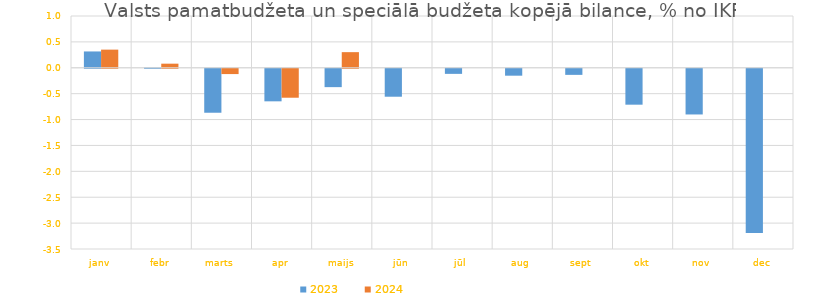
| Category | 2023 | 2024 |
|---|---|---|
| janv | 0.315 | 0.35 |
| febr | 0.007 | 0.079 |
| marts | -0.849 | -0.102 |
| apr | -0.629 | -0.559 |
| maijs | -0.355 | 0.302 |
| jūn | -0.54 | 0 |
| jūl | -0.098 | 0 |
| aug | -0.134 | 0 |
| sept | -0.118 | 0 |
| okt | -0.693 | 0 |
| nov | -0.882 | 0 |
| dec | -3.171 | 0 |